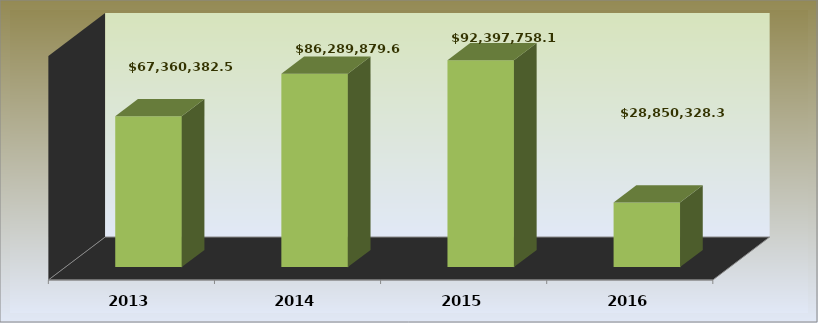
| Category | Series 0 |
|---|---|
| 2013.0 | 67360382.57 |
| 2014.0 | 86289879.62 |
| 2015.0 | 92397758.15 |
| 2016.0 | 28850328.39 |